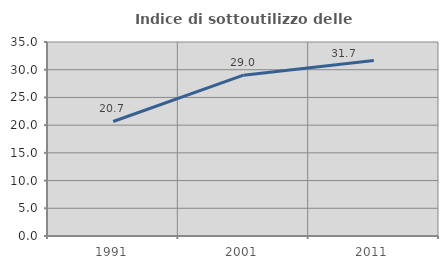
| Category | Indice di sottoutilizzo delle abitazioni  |
|---|---|
| 1991.0 | 20.661 |
| 2001.0 | 29.018 |
| 2011.0 | 31.683 |